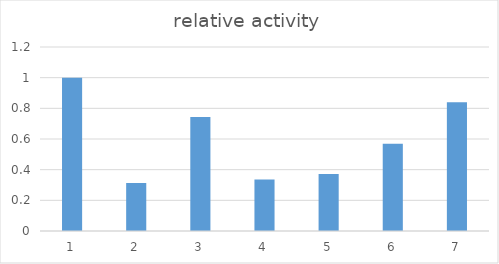
| Category | Series 0 |
|---|---|
| 0 | 1 |
| 1 | 0.312 |
| 2 | 0.743 |
| 3 | 0.335 |
| 4 | 0.372 |
| 5 | 0.569 |
| 6 | 0.839 |